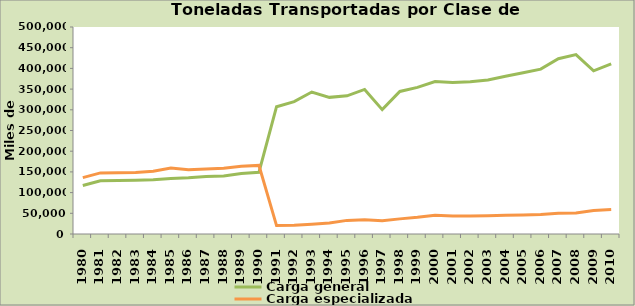
| Category | Carga general | Carga especializada |
|---|---|---|
| 1980.0 | 117023 | 136146 |
| 1981.0 | 128754 | 147538 |
| 1982.0 | 129354 | 147999 |
| 1983.0 | 129714 | 148368 |
| 1984.0 | 130806 | 151377 |
| 1985.0 | 134112 | 159297 |
| 1986.0 | 135595 | 154964 |
| 1987.0 | 138810 | 157278 |
| 1988.0 | 140134 | 158736 |
| 1989.0 | 146292 | 163511 |
| 1990.0 | 149009 | 165666 |
| 1991.0 | 307444 | 20329 |
| 1992.0 | 319742 | 21318 |
| 1993.0 | 342871 | 23757 |
| 1994.0 | 330053 | 26434 |
| 1995.0 | 333800 | 32873 |
| 1996.0 | 349142 | 34125 |
| 1997.0 | 300444 | 32022 |
| 1998.0 | 344282 | 36519 |
| 1999.0 | 354241 | 40191 |
| 2000.0 | 368066 | 45127 |
| 2001.0 | 365912 | 43298 |
| 2002.0 | 367600 | 43500 |
| 2003.0 | 372150 | 44050 |
| 2004.0 | 381000 | 45100 |
| 2005.0 | 389400 | 46100 |
| 2006.0 | 398158 | 47291 |
| 2007.0 | 423458.767 | 50401.095 |
| 2008.0 | 433400 | 50900 |
| 2009.0 | 394079 | 56821 |
| 2010.0 | 410772 | 59228 |